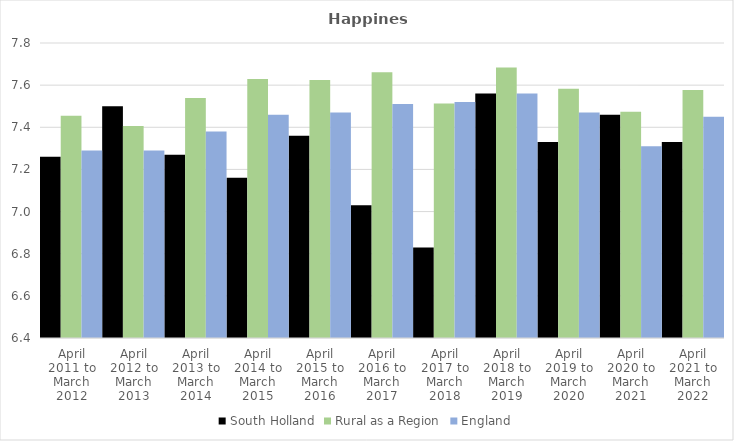
| Category | South Holland | Rural as a Region | England |
|---|---|---|---|
| April 2011 to March 2012 | 7.26 | 7.454 | 7.29 |
| April 2012 to March 2013 | 7.5 | 7.406 | 7.29 |
| April 2013 to March 2014 | 7.27 | 7.539 | 7.38 |
| April 2014 to March 2015 | 7.16 | 7.63 | 7.46 |
| April 2015 to March 2016 | 7.36 | 7.625 | 7.47 |
| April 2016 to March 2017 | 7.03 | 7.661 | 7.51 |
| April 2017 to March 2018 | 6.83 | 7.513 | 7.52 |
| April 2018 to March 2019 | 7.56 | 7.684 | 7.56 |
| April 2019 to March 2020 | 7.33 | 7.582 | 7.47 |
| April 2020 to March 2021 | 7.46 | 7.474 | 7.31 |
| April 2021 to March 2022 | 7.33 | 7.577 | 7.45 |